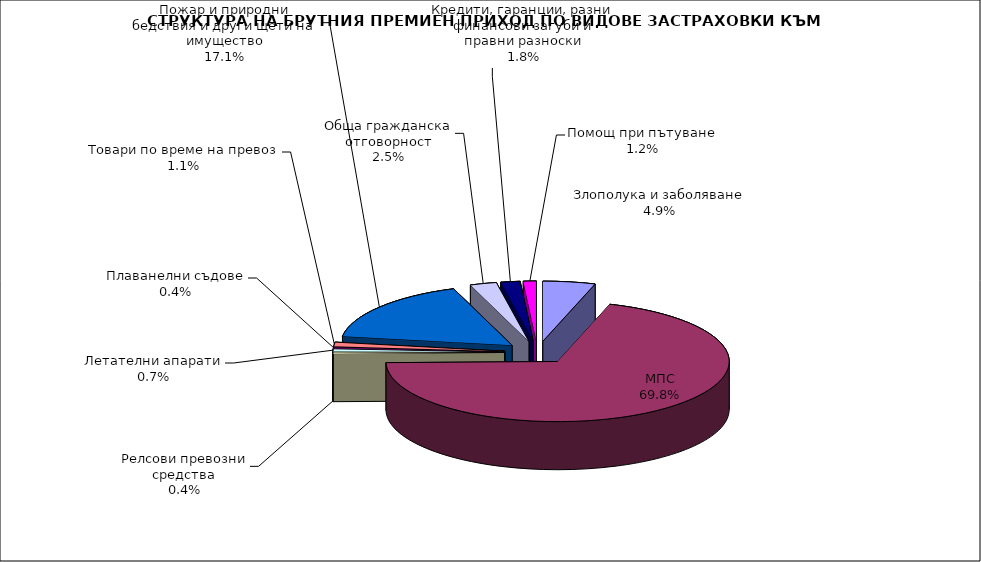
| Category | Злополука и заболяване МПС Релсови превозни средства Летателни апарати Плаванелни съдове Товари по време на превоз Пожар и природни бедствия и други щети на имущество Обща гражданска отговорност Кредити, гаранции, разни финансови загуби и правни разноски  |
|---|---|
| Злополука и заболяване | 0.049 |
| МПС | 0.698 |
| Релсови превозни средства | 0.004 |
| Летателни апарати | 0.007 |
| Плаванелни съдове | 0.004 |
| Товари по време на превоз | 0.011 |
| Пожар и природни бедствия и други щети на имущество | 0.171 |
| Обща гражданска отговорност | 0.025 |
| Кредити, гаранции, разни финансови загуби и правни разноски | 0.018 |
| Помощ при пътуване | 0.012 |